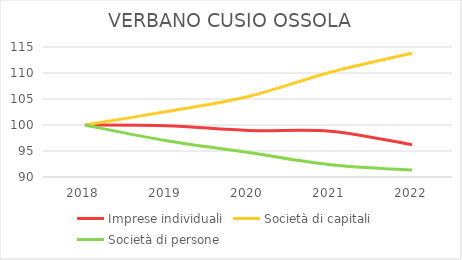
| Category | Imprese individuali | Società di capitali | Società di persone |
|---|---|---|---|
| 2018.0 | 100 | 100 | 100 |
| 2019.0 | 99.86 | 102.588 | 96.96 |
| 2020.0 | 98.94 | 105.479 | 94.691 |
| 2021.0 | 98.82 | 110.138 | 92.377 |
| 2022.0 | 96.202 | 113.805 | 91.334 |